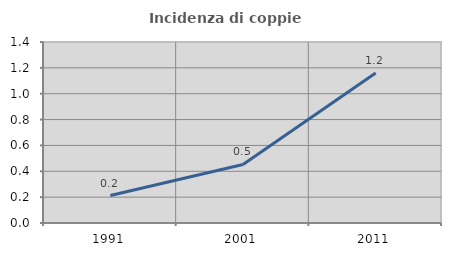
| Category | Incidenza di coppie miste |
|---|---|
| 1991.0 | 0.212 |
| 2001.0 | 0.453 |
| 2011.0 | 1.159 |